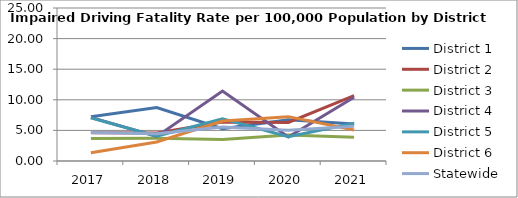
| Category | District 1 | District 2 | District 3 | District 4 | District 5 | District 6 | Statewide |
|---|---|---|---|---|---|---|---|
| 2017.0 | 7.239 | 4.607 | 3.695 | 7.117 | 7.065 | 1.35 | 4.659 |
| 2018.0 | 8.743 | 4.559 | 3.719 | 4.019 | 4.059 | 3.096 | 4.446 |
| 2019.0 | 5.288 | 6.377 | 3.509 | 11.441 | 6.897 | 6.526 | 5.54 |
| 2020.0 | 6.734 | 6.301 | 4.239 | 3.921 | 3.985 | 7.248 | 5.036 |
| 2021.0 | 6.029 | 10.675 | 3.872 | 10.427 | 6.179 | 5.08 | 5.681 |